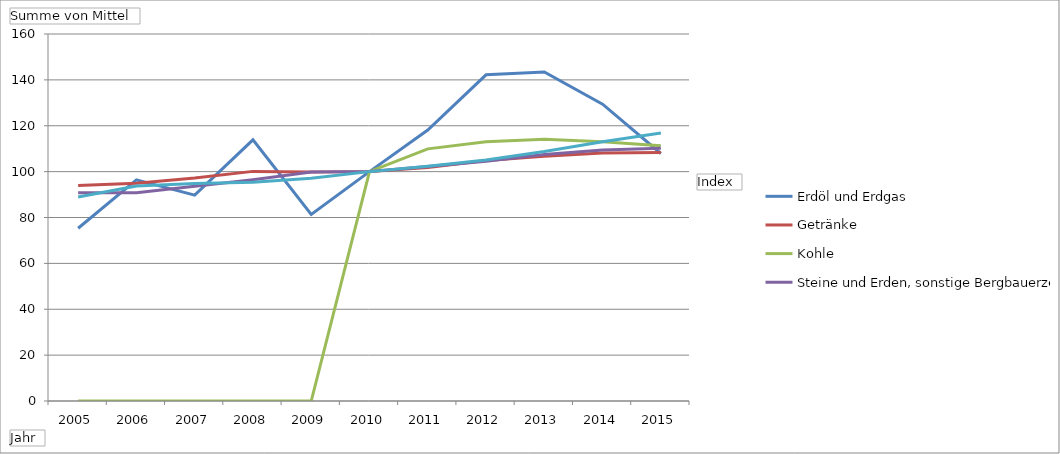
| Category | Erdöl und Erdgas | Getränke | Kohle | Steine und Erden, sonstige Bergbauerzeugnisse | Tabakerzeugnisse |
|---|---|---|---|---|---|
| 2005 | 75.317 | 93.983 | 0 | 90.833 | 88.9 |
| 2006 | 96.408 | 94.908 | 0 | 90.775 | 93.717 |
| 2007 | 89.75 | 97.183 | 0 | 93.625 | 94.842 |
| 2008 | 113.858 | 100.108 | 0 | 96.492 | 95.383 |
| 2009 | 81.333 | 99.883 | 0 | 99.867 | 97.108 |
| 2010 | 100.017 | 100 | 99.983 | 100.008 | 100 |
| 2011 | 118.158 | 101.833 | 109.917 | 102.233 | 102.308 |
| 2012 | 142.217 | 104.808 | 113 | 104.483 | 105.117 |
| 2013 | 143.433 | 106.717 | 114.1 | 107.458 | 108.742 |
| 2014 | 129.4 | 108.108 | 113.017 | 109.442 | 113.025 |
| 2015 | 107.908 | 108.383 | 111.333 | 110.142 | 116.867 |